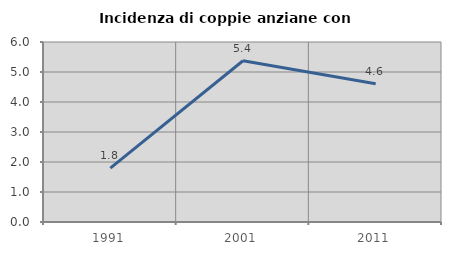
| Category | Incidenza di coppie anziane con figli |
|---|---|
| 1991.0 | 1.796 |
| 2001.0 | 5.376 |
| 2011.0 | 4.608 |